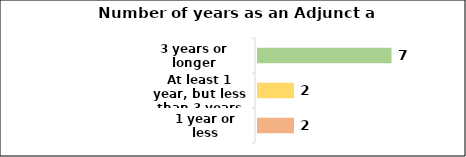
| Category | 1 year or less |
|---|---|
| 1 year or less | 2 |
| At least 1 year, but less than 3 years | 2 |
| 3 years or longer | 7 |